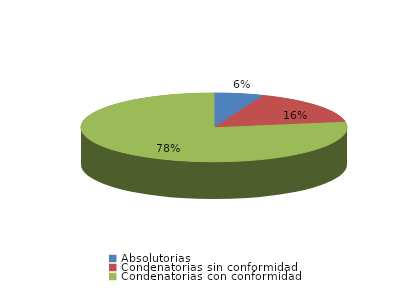
| Category | Series 0 |
|---|---|
| Absolutorias | 4 |
| Condenatorias sin conformidad | 11 |
| Condenatorias con conformidad | 52 |